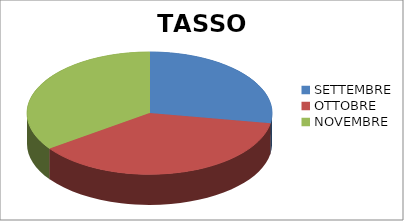
| Category | TASSO ASSENZE |
|---|---|
| SETTEMBRE | 0.049 |
| OTTOBRE | 0.066 |
| NOVEMBRE | 0.062 |